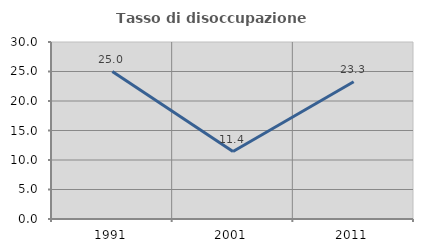
| Category | Tasso di disoccupazione giovanile  |
|---|---|
| 1991.0 | 25 |
| 2001.0 | 11.429 |
| 2011.0 | 23.256 |